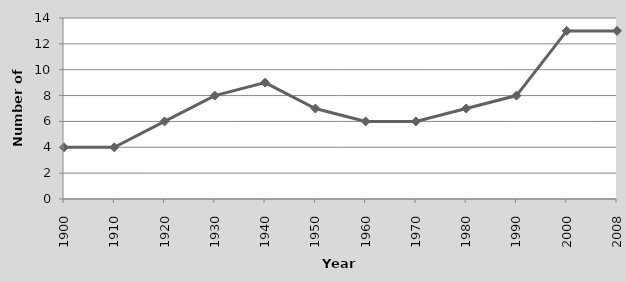
| Category | Number of countries  |
|---|---|
| 1900.0 | 4 |
| 1910.0 | 4 |
| 1920.0 | 6 |
| 1930.0 | 8 |
| 1940.0 | 9 |
| 1950.0 | 7 |
| 1960.0 | 6 |
| 1970.0 | 6 |
| 1980.0 | 7 |
| 1990.0 | 8 |
| 2000.0 | 13 |
| 2008.0 | 13 |